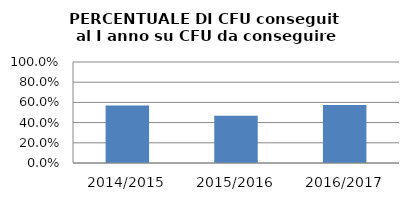
| Category | 2014/2015 2015/2016 2016/2017 |
|---|---|
| 2014/2015 | 0.57 |
| 2015/2016 | 0.467 |
| 2016/2017 | 0.575 |